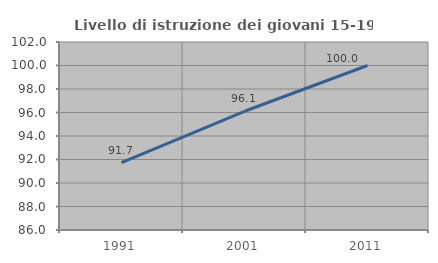
| Category | Livello di istruzione dei giovani 15-19 anni |
|---|---|
| 1991.0 | 91.743 |
| 2001.0 | 96.104 |
| 2011.0 | 100 |